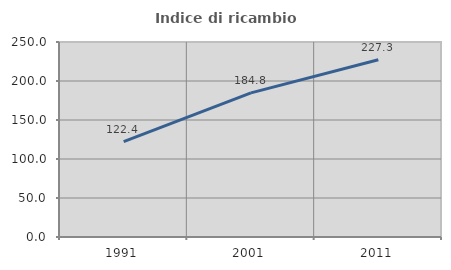
| Category | Indice di ricambio occupazionale  |
|---|---|
| 1991.0 | 122.365 |
| 2001.0 | 184.788 |
| 2011.0 | 227.317 |